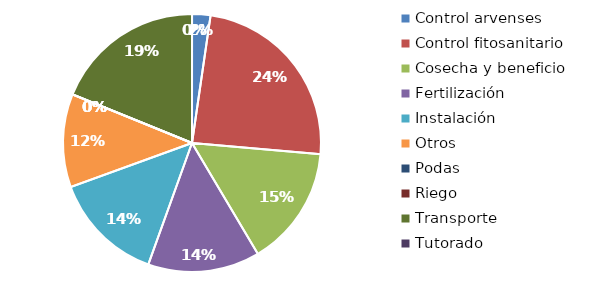
| Category | Valor |
|---|---|
| Control arvenses | 66000 |
| Control fitosanitario | 690000 |
| Cosecha y beneficio | 432000 |
| Fertilización | 401999.8 |
| Instalación | 400000 |
| Otros | 335000 |
| Podas | 0 |
| Riego | 0 |
| Transporte | 540000 |
| Tutorado | 0 |